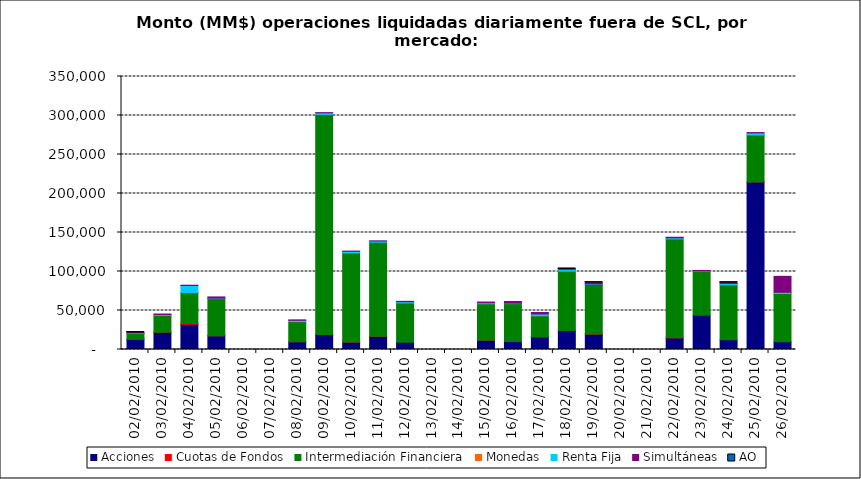
| Category | Acciones | Cuotas de Fondos | Intermediación Financiera | Monedas | Renta Fija | Simultáneas | AO |
|---|---|---|---|---|---|---|---|
| 02/02/2010 | 13195.851 | 13.944 | 7427.031 | 13.26 | 693.97 | 385.272 | 0.304 |
| 03/02/2010 | 22088.555 | 81.635 | 21384.201 | 6.255 | 1195.934 | 724.181 | 0 |
| 04/02/2010 | 32315.693 | 1291.47 | 39414.725 | 3.12 | 9038.559 | 360.829 | 0 |
| 05/02/2010 | 17575.116 | 15.736 | 47706.21 | 1.17 | 593.691 | 1516.061 | 0 |
| 08/02/2010 | 9930.72 | 45.654 | 25831.287 | 0.78 | 1606.039 | 526.95 | 0 |
| 09/02/2010 | 19380.537 | 0 | 282022.571 | 0.78 | 1944.941 | 260.769 | 0 |
| 10/02/2010 | 9488.115 | 6.357 | 114321.694 | 0 | 2148.716 | 135.518 | 0 |
| 11/02/2010 | 16907.728 | 36.509 | 120587.862 | 0 | 1543.991 | 98.648 | 0 |
| 12/02/2010 | 9312.8 | 0 | 50534.433 | 11.31 | 1397.769 | 502.874 | 0 |
| 15/02/2010 | 11929.509 | 123.454 | 46578.004 | 0 | 1357.419 | 863.894 | 0 |
| 16/02/2010 | 10337.179 | 132.761 | 48307.441 | 0 | 708.851 | 2036.834 | 0 |
| 17/02/2010 | 16100.015 | 318.801 | 26929.127 | 7.745 | 2210.017 | 1826.398 | 0 |
| 18/02/2010 | 24272.865 | 15.375 | 76404.261 | 2.295 | 2124.262 | 413.18 | 0.016 |
| 19/02/2010 | 19710.067 | 29.991 | 63688.028 | 0 | 588.245 | 1693.429 | 0.055 |
| 22/02/2010 | 14861.926 | 54.158 | 127055.026 | 1.512 | 1212.387 | 728.28 | 0 |
| 23/02/2010 | 43931.633 | 0 | 56834.965 | 0.376 | 201.773 | 397.124 | 0 |
| 24/02/2010 | 12441.359 | 0 | 70566.152 | 18.063 | 1656.213 | 1025.246 | 0.1 |
| 25/02/2010 | 214855.455 | 13.269 | 60388.285 | 1.11 | 2436.826 | 373.454 | 0 |
| 26/02/2010 | 9980.297 | 0 | 61775.594 | 4.421 | 1575.731 | 20444.161 | 0 |